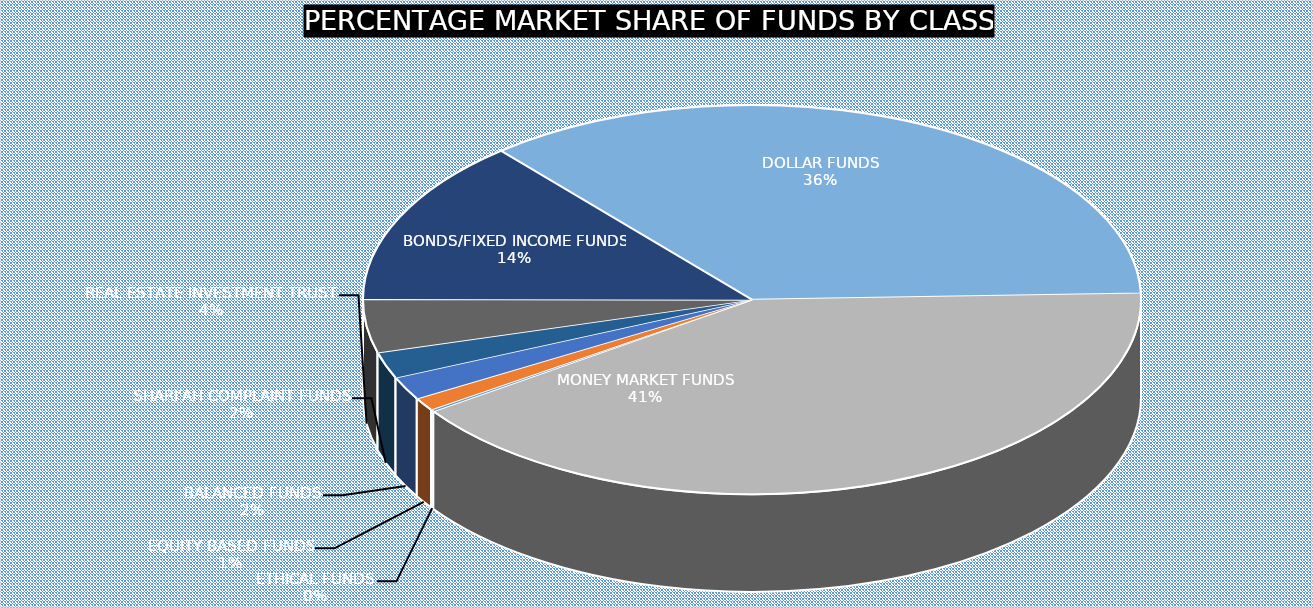
| Category | November 2023 |
|---|---|
| ETHICAL FUNDS | 3471817789.06 |
| EQUITY BASED FUNDS | 23046675780.47 |
| BALANCED FUNDS | 40559468372.72 |
| SHARI'AH COMPLAINT FUNDS | 46397618335.008 |
| REAL ESTATE INVESTMENT TRUST | 93995813289.46 |
| BONDS/FIXED INCOME FUNDS | 292870242880.21 |
| DOLLAR FUNDS | 756917779529.787 |
| MONEY MARKET FUNDS | 865757176891.71 |